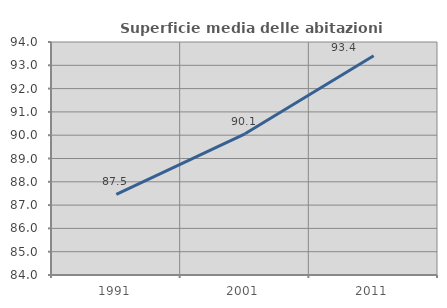
| Category | Superficie media delle abitazioni occupate |
|---|---|
| 1991.0 | 87.46 |
| 2001.0 | 90.061 |
| 2011.0 | 93.41 |